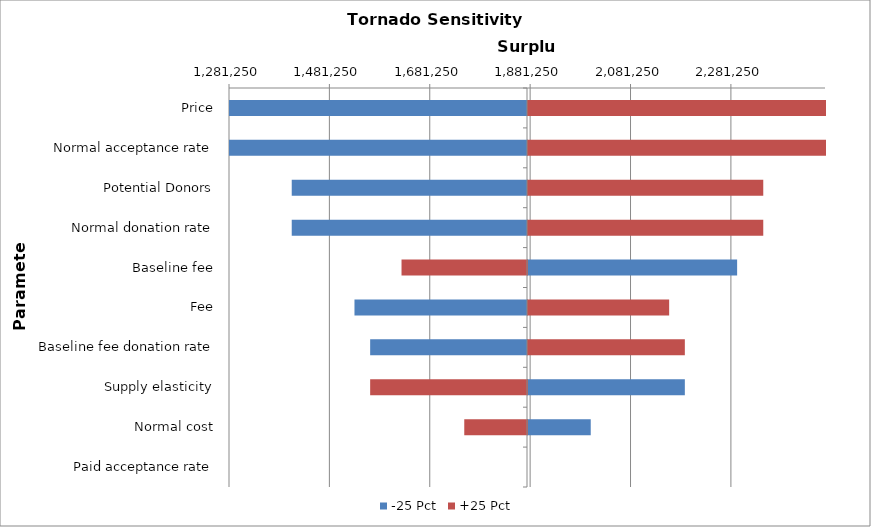
| Category | -25 Pct | +25 Pct |
|---|---|---|
| Price | 1281250 | 2468750 |
| Normal acceptance rate | 1281250 | 2468750 |
| Potential Donors | 1406250 | 2343750 |
| Normal donation rate | 1406250 | 2343750 |
| Baseline fee | 2291666.667 | 1625000 |
| Fee | 1531250 | 2156250 |
| Baseline fee donation rate | 1562500 | 2187500 |
| Supply elasticity | 2187500 | 1562500 |
| Normal cost | 2000000 | 1750000 |
| Paid acceptance rate | 1875000 | 1875000 |